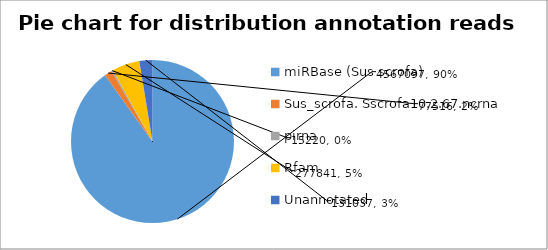
| Category | Series 0 |
|---|---|
| miRBase (Sus scrofa) | 4567097 |
| Sus_scrofa. Sscrofa10.2.67.ncrna | 77516 |
| pirna | 15220 |
| Rfam | 277841 |
| Unannotated  | 131037 |